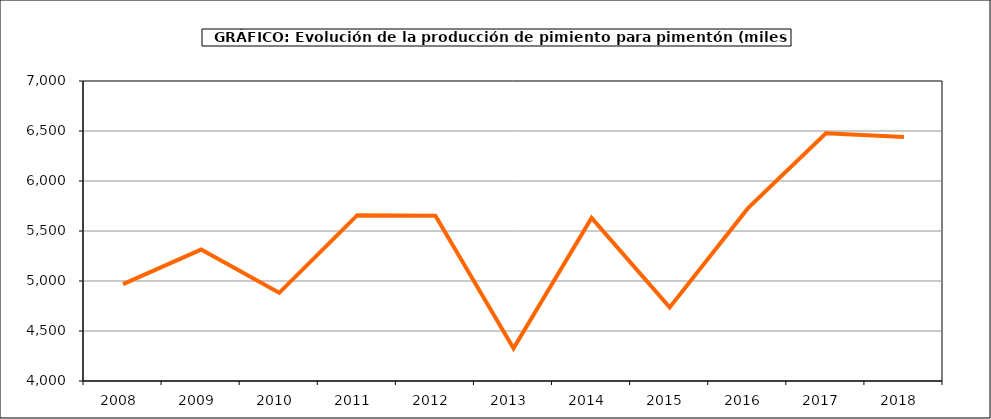
| Category | Producción |
|---|---|
| 2008.0 | 4969 |
| 2009.0 | 5314 |
| 2010.0 | 4882 |
| 2011.0 | 5658 |
| 2012.0 | 5652 |
| 2013.0 | 4327 |
| 2014.0 | 5630 |
| 2015.0 | 4736 |
| 2016.0 | 5726 |
| 2017.0 | 6478 |
| 2018.0 | 6439 |